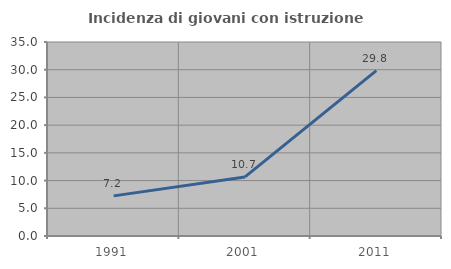
| Category | Incidenza di giovani con istruzione universitaria |
|---|---|
| 1991.0 | 7.237 |
| 2001.0 | 10.656 |
| 2011.0 | 29.825 |